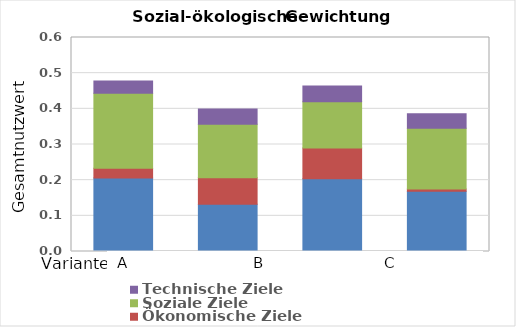
| Category | Umwelt- und Ressourcenschutz | Ökonomische Ziele | Soziale Ziele | Technische Ziele |
|---|---|---|---|---|
| 0 | 0.206 | 0.028 | 0.21 | 0.034 |
| 1 | 0.133 | 0.074 | 0.15 | 0.043 |
| 2 | 0.204 | 0.086 | 0.13 | 0.044 |
| 3 | 0.169 | 0.007 | 0.17 | 0.041 |